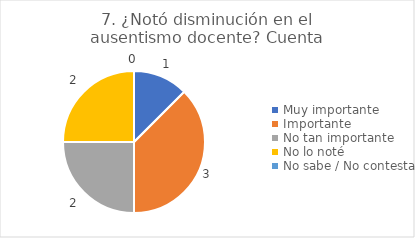
| Category | 7. ¿Notó disminución en el ausentismo docente? |
|---|---|
| Muy importante  | 0.125 |
| Importante  | 0.375 |
| No tan importante  | 0.25 |
| No lo noté  | 0.25 |
| No sabe / No contesta | 0 |